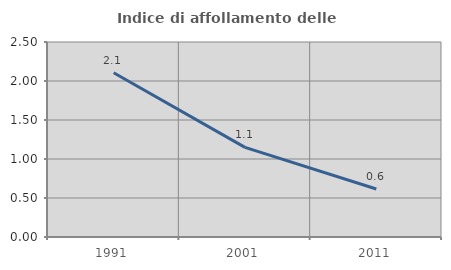
| Category | Indice di affollamento delle abitazioni  |
|---|---|
| 1991.0 | 2.107 |
| 2001.0 | 1.149 |
| 2011.0 | 0.616 |